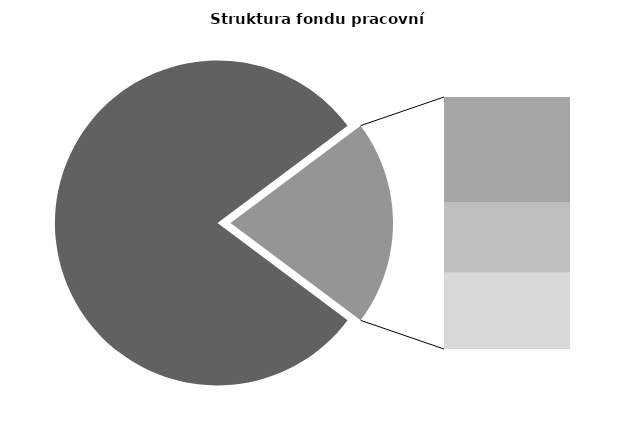
| Category | Series 0 |
|---|---|
| Průměrná měsíční odpracovaná doba bez přesčasu | 134.939 |
| Dovolená | 14.543 |
| Nemoc | 9.636 |
| Jiné | 10.508 |